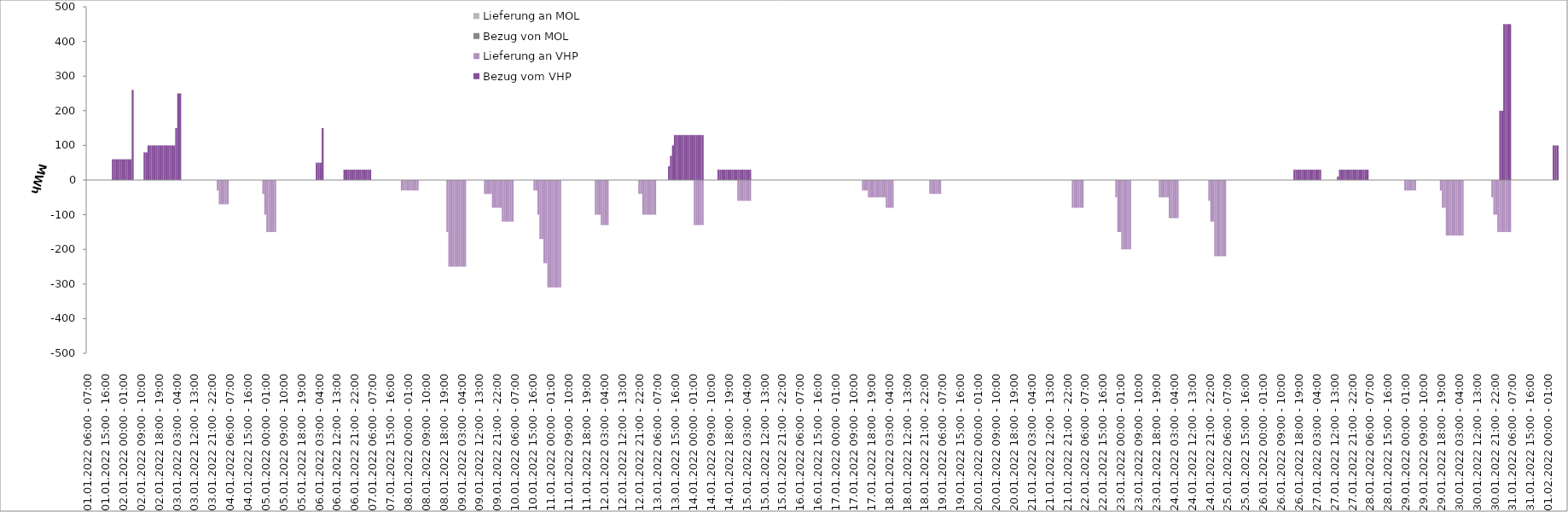
| Category | Bezug vom VHP | Lieferung an VHP | Bezug von MOL | Lieferung an MOL |
|---|---|---|---|---|
| 01.01.2022 06:00 - 07:00 | 0 | 0 | 0 | 0 |
| 01.01.2022 07:00 - 08:00 | 0 | 0 | 0 | 0 |
| 01.01.2022 08:00 - 09:00 | 0 | 0 | 0 | 0 |
| 01.01.2022 09:00 - 10:00 | 0 | 0 | 0 | 0 |
| 01.01.2022 10:00 - 11:00 | 0 | 0 | 0 | 0 |
| 01.01.2022 11:00 - 12:00 | 0 | 0 | 0 | 0 |
| 01.01.2022 12:00 - 13:00 | 0 | 0 | 0 | 0 |
| 01.01.2022 13:00 - 14:00 | 0 | 0 | 0 | 0 |
| 01.01.2022 14:00 - 15:00 | 0 | 0 | 0 | 0 |
| 01.01.2022 15:00 - 16:00 | 0 | 0 | 0 | 0 |
| 01.01.2022 16:00 - 17:00 | 0 | 0 | 0 | 0 |
| 01.01.2022 17:00 - 18:00 | 0 | 0 | 0 | 0 |
| 01.01.2022 18:00 - 19:00 | 0 | 0 | 0 | 0 |
| 01.01.2022 19:00 - 20:00 | 60 | 0 | 0 | 0 |
| 01.01.2022 20:00 - 21:00 | 60 | 0 | 0 | 0 |
| 01.01.2022 21:00 - 22:00 | 60 | 0 | 0 | 0 |
| 01.01.2022 22:00 - 23:00 | 60 | 0 | 0 | 0 |
| 01.01.2022 23:00 - 24:00 | 60 | 0 | 0 | 0 |
| 02.01.2022 00:00 - 01:00 | 60 | 0 | 0 | 0 |
| 02.01.2022 01:00 - 02:00 | 60 | 0 | 0 | 0 |
| 02.01.2022 02:00 - 03:00 | 60 | 0 | 0 | 0 |
| 02.01.2022 03:00 - 04:00 | 60 | 0 | 0 | 0 |
| 02.01.2022 04:00 - 05:00 | 60 | 0 | 0 | 0 |
| 02.01.2022 05:00 - 06:00 | 260 | 0 | 0 | 0 |
| 02.01.2022 06:00 - 07:00 | 0 | 0 | 0 | 0 |
| 02.01.2022 07:00 - 08:00 | 0 | 0 | 0 | 0 |
| 02.01.2022 08:00 - 09:00 | 0 | 0 | 0 | 0 |
| 02.01.2022 09:00 - 10:00 | 0 | 0 | 0 | 0 |
| 02.01.2022 10:00 - 11:00 | 0 | 0 | 0 | 0 |
| 02.01.2022 11:00 - 12:00 | 80 | 0 | 0 | 0 |
| 02.01.2022 12:00 - 13:00 | 80 | 0 | 0 | 0 |
| 02.01.2022 13:00 - 14:00 | 100 | 0 | 0 | 0 |
| 02.01.2022 14:00 - 15:00 | 100 | 0 | 0 | 0 |
| 02.01.2022 15:00 - 16:00 | 100 | 0 | 0 | 0 |
| 02.01.2022 16:00 - 17:00 | 100 | 0 | 0 | 0 |
| 02.01.2022 17:00 - 18:00 | 100 | 0 | 0 | 0 |
| 02.01.2022 18:00 - 19:00 | 100 | 0 | 0 | 0 |
| 02.01.2022 19:00 - 20:00 | 100 | 0 | 0 | 0 |
| 02.01.2022 20:00 - 21:00 | 100 | 0 | 0 | 0 |
| 02.01.2022 21:00 - 22:00 | 100 | 0 | 0 | 0 |
| 02.01.2022 22:00 - 23:00 | 100 | 0 | 0 | 0 |
| 02.01.2022 23:00 - 24:00 | 100 | 0 | 0 | 0 |
| 03.01.2022 00:00 - 01:00 | 100 | 0 | 0 | 0 |
| 03.01.2022 01:00 - 02:00 | 100 | 0 | 0 | 0 |
| 03.01.2022 02:00 - 03:00 | 100 | 0 | 0 | 0 |
| 03.01.2022 03:00 - 04:00 | 150 | 0 | 0 | 0 |
| 03.01.2022 04:00 - 05:00 | 250 | 0 | 0 | 0 |
| 03.01.2022 05:00 - 06:00 | 250 | 0 | 0 | 0 |
| 03.01.2022 06:00 - 07:00 | 0 | 0 | 0 | 0 |
| 03.01.2022 07:00 - 08:00 | 0 | 0 | 0 | 0 |
| 03.01.2022 08:00 - 09:00 | 0 | 0 | 0 | 0 |
| 03.01.2022 09:00 - 10:00 | 0 | 0 | 0 | 0 |
| 03.01.2022 10:00 - 11:00 | 0 | 0 | 0 | 0 |
| 03.01.2022 11:00 - 12:00 | 0 | 0 | 0 | 0 |
| 03.01.2022 12:00 - 13:00 | 0 | 0 | 0 | 0 |
| 03.01.2022 13:00 - 14:00 | 0 | 0 | 0 | 0 |
| 03.01.2022 14:00 - 15:00 | 0 | 0 | 0 | 0 |
| 03.01.2022 15:00 - 16:00 | 0 | 0 | 0 | 0 |
| 03.01.2022 16:00 - 17:00 | 0 | 0 | 0 | 0 |
| 03.01.2022 17:00 - 18:00 | 0 | 0 | 0 | 0 |
| 03.01.2022 18:00 - 19:00 | 0 | 0 | 0 | 0 |
| 03.01.2022 19:00 - 20:00 | 0 | 0 | 0 | 0 |
| 03.01.2022 20:00 - 21:00 | 0 | 0 | 0 | 0 |
| 03.01.2022 21:00 - 22:00 | 0 | 0 | 0 | 0 |
| 03.01.2022 22:00 - 23:00 | 0 | 0 | 0 | 0 |
| 03.01.2022 23:00 - 24:00 | 0 | 0 | 0 | 0 |
| 04.01.2022 00:00 - 01:00 | 0 | -30 | 0 | 0 |
| 04.01.2022 01:00 - 02:00 | 0 | -70 | 0 | 0 |
| 04.01.2022 02:00 - 03:00 | 0 | -70 | 0 | 0 |
| 04.01.2022 03:00 - 04:00 | 0 | -70 | 0 | 0 |
| 04.01.2022 04:00 - 05:00 | 0 | -70 | 0 | 0 |
| 04.01.2022 05:00 - 06:00 | 0 | -70 | 0 | 0 |
| 04.01.2022 06:00 - 07:00 | 0 | 0 | 0 | 0 |
| 04.01.2022 07:00 - 08:00 | 0 | 0 | 0 | 0 |
| 04.01.2022 08:00 - 09:00 | 0 | 0 | 0 | 0 |
| 04.01.2022 09:00 - 10:00 | 0 | 0 | 0 | 0 |
| 04.01.2022 10:00 - 11:00 | 0 | 0 | 0 | 0 |
| 04.01.2022 11:00 - 12:00 | 0 | 0 | 0 | 0 |
| 04.01.2022 12:00 - 13:00 | 0 | 0 | 0 | 0 |
| 04.01.2022 13:00 - 14:00 | 0 | 0 | 0 | 0 |
| 04.01.2022 14:00 - 15:00 | 0 | 0 | 0 | 0 |
| 04.01.2022 15:00 - 16:00 | 0 | 0 | 0 | 0 |
| 04.01.2022 16:00 - 17:00 | 0 | 0 | 0 | 0 |
| 04.01.2022 17:00 - 18:00 | 0 | 0 | 0 | 0 |
| 04.01.2022 18:00 - 19:00 | 0 | 0 | 0 | 0 |
| 04.01.2022 19:00 - 20:00 | 0 | 0 | 0 | 0 |
| 04.01.2022 20:00 - 21:00 | 0 | 0 | 0 | 0 |
| 04.01.2022 21:00 - 22:00 | 0 | 0 | 0 | 0 |
| 04.01.2022 22:00 - 23:00 | 0 | 0 | 0 | 0 |
| 04.01.2022 23:00 - 24:00 | 0 | -40 | 0 | 0 |
| 05.01.2022 00:00 - 01:00 | 0 | -100 | 0 | 0 |
| 05.01.2022 01:00 - 02:00 | 0 | -150 | 0 | 0 |
| 05.01.2022 02:00 - 03:00 | 0 | -150 | 0 | 0 |
| 05.01.2022 03:00 - 04:00 | 0 | -150 | 0 | 0 |
| 05.01.2022 04:00 - 05:00 | 0 | -150 | 0 | 0 |
| 05.01.2022 05:00 - 06:00 | 0 | -150 | 0 | 0 |
| 05.01.2022 06:00 - 07:00 | 0 | 0 | 0 | 0 |
| 05.01.2022 07:00 - 08:00 | 0 | 0 | 0 | 0 |
| 05.01.2022 08:00 - 09:00 | 0 | 0 | 0 | 0 |
| 05.01.2022 09:00 - 10:00 | 0 | 0 | 0 | 0 |
| 05.01.2022 10:00 - 11:00 | 0 | 0 | 0 | 0 |
| 05.01.2022 11:00 - 12:00 | 0 | 0 | 0 | 0 |
| 05.01.2022 12:00 - 13:00 | 0 | 0 | 0 | 0 |
| 05.01.2022 13:00 - 14:00 | 0 | 0 | 0 | 0 |
| 05.01.2022 14:00 - 15:00 | 0 | 0 | 0 | 0 |
| 05.01.2022 15:00 - 16:00 | 0 | 0 | 0 | 0 |
| 05.01.2022 16:00 - 17:00 | 0 | 0 | 0 | 0 |
| 05.01.2022 17:00 - 18:00 | 0 | 0 | 0 | 0 |
| 05.01.2022 18:00 - 19:00 | 0 | 0 | 0 | 0 |
| 05.01.2022 19:00 - 20:00 | 0 | 0 | 0 | 0 |
| 05.01.2022 20:00 - 21:00 | 0 | 0 | 0 | 0 |
| 05.01.2022 21:00 - 22:00 | 0 | 0 | 0 | 0 |
| 05.01.2022 22:00 - 23:00 | 0 | 0 | 0 | 0 |
| 05.01.2022 23:00 - 24:00 | 0 | 0 | 0 | 0 |
| 06.01.2022 00:00 - 01:00 | 0 | 0 | 0 | 0 |
| 06.01.2022 01:00 - 02:00 | 0 | 0 | 0 | 0 |
| 06.01.2022 02:00 - 03:00 | 50 | 0 | 0 | 0 |
| 06.01.2022 03:00 - 04:00 | 50 | 0 | 0 | 0 |
| 06.01.2022 04:00 - 05:00 | 50 | 0 | 0 | 0 |
| 06.01.2022 05:00 - 06:00 | 150 | 0 | 0 | 0 |
| 06.01.2022 06:00 - 07:00 | 0 | 0 | 0 | 0 |
| 06.01.2022 07:00 - 08:00 | 0 | 0 | 0 | 0 |
| 06.01.2022 08:00 - 09:00 | 0 | 0 | 0 | 0 |
| 06.01.2022 09:00 - 10:00 | 0 | 0 | 0 | 0 |
| 06.01.2022 10:00 - 11:00 | 0 | 0 | 0 | 0 |
| 06.01.2022 11:00 - 12:00 | 0 | 0 | 0 | 0 |
| 06.01.2022 12:00 - 13:00 | 0 | 0 | 0 | 0 |
| 06.01.2022 13:00 - 14:00 | 0 | 0 | 0 | 0 |
| 06.01.2022 14:00 - 15:00 | 0 | 0 | 0 | 0 |
| 06.01.2022 15:00 - 16:00 | 0 | 0 | 0 | 0 |
| 06.01.2022 16:00 - 17:00 | 30 | 0 | 0 | 0 |
| 06.01.2022 17:00 - 18:00 | 30 | 0 | 0 | 0 |
| 06.01.2022 18:00 - 19:00 | 30 | 0 | 0 | 0 |
| 06.01.2022 19:00 - 20:00 | 30 | 0 | 0 | 0 |
| 06.01.2022 20:00 - 21:00 | 30 | 0 | 0 | 0 |
| 06.01.2022 21:00 - 22:00 | 30 | 0 | 0 | 0 |
| 06.01.2022 22:00 - 23:00 | 30 | 0 | 0 | 0 |
| 06.01.2022 23:00 - 24:00 | 30 | 0 | 0 | 0 |
| 07.01.2022 00:00 - 01:00 | 30 | 0 | 0 | 0 |
| 07.01.2022 01:00 - 02:00 | 30 | 0 | 0 | 0 |
| 07.01.2022 02:00 - 03:00 | 30 | 0 | 0 | 0 |
| 07.01.2022 03:00 - 04:00 | 30 | 0 | 0 | 0 |
| 07.01.2022 04:00 - 05:00 | 30 | 0 | 0 | 0 |
| 07.01.2022 05:00 - 06:00 | 30 | 0 | 0 | 0 |
| 07.01.2022 06:00 - 07:00 | 0 | 0 | 0 | 0 |
| 07.01.2022 07:00 - 08:00 | 0 | 0 | 0 | 0 |
| 07.01.2022 08:00 - 09:00 | 0 | 0 | 0 | 0 |
| 07.01.2022 09:00 - 10:00 | 0 | 0 | 0 | 0 |
| 07.01.2022 10:00 - 11:00 | 0 | 0 | 0 | 0 |
| 07.01.2022 11:00 - 12:00 | 0 | 0 | 0 | 0 |
| 07.01.2022 12:00 - 13:00 | 0 | 0 | 0 | 0 |
| 07.01.2022 13:00 - 14:00 | 0 | 0 | 0 | 0 |
| 07.01.2022 14:00 - 15:00 | 0 | 0 | 0 | 0 |
| 07.01.2022 15:00 - 16:00 | 0 | 0 | 0 | 0 |
| 07.01.2022 16:00 - 17:00 | 0 | 0 | 0 | 0 |
| 07.01.2022 17:00 - 18:00 | 0 | 0 | 0 | 0 |
| 07.01.2022 18:00 - 19:00 | 0 | 0 | 0 | 0 |
| 07.01.2022 19:00 - 20:00 | 0 | 0 | 0 | 0 |
| 07.01.2022 20:00 - 21:00 | 0 | 0 | 0 | 0 |
| 07.01.2022 21:00 - 22:00 | 0 | -30 | 0 | 0 |
| 07.01.2022 22:00 - 23:00 | 0 | -30 | 0 | 0 |
| 07.01.2022 23:00 - 24:00 | 0 | -30 | 0 | 0 |
| 08.01.2022 00:00 - 01:00 | 0 | -30 | 0 | 0 |
| 08.01.2022 01:00 - 02:00 | 0 | -30 | 0 | 0 |
| 08.01.2022 02:00 - 03:00 | 0 | -30 | 0 | 0 |
| 08.01.2022 03:00 - 04:00 | 0 | -30 | 0 | 0 |
| 08.01.2022 04:00 - 05:00 | 0 | -30 | 0 | 0 |
| 08.01.2022 05:00 - 06:00 | 0 | -30 | 0 | 0 |
| 08.01.2022 06:00 - 07:00 | 0 | 0 | 0 | 0 |
| 08.01.2022 07:00 - 08:00 | 0 | 0 | 0 | 0 |
| 08.01.2022 08:00 - 09:00 | 0 | 0 | 0 | 0 |
| 08.01.2022 09:00 - 10:00 | 0 | 0 | 0 | 0 |
| 08.01.2022 10:00 - 11:00 | 0 | 0 | 0 | 0 |
| 08.01.2022 11:00 - 12:00 | 0 | 0 | 0 | 0 |
| 08.01.2022 12:00 - 13:00 | 0 | 0 | 0 | 0 |
| 08.01.2022 13:00 - 14:00 | 0 | 0 | 0 | 0 |
| 08.01.2022 14:00 - 15:00 | 0 | 0 | 0 | 0 |
| 08.01.2022 15:00 - 16:00 | 0 | 0 | 0 | 0 |
| 08.01.2022 16:00 - 17:00 | 0 | 0 | 0 | 0 |
| 08.01.2022 17:00 - 18:00 | 0 | 0 | 0 | 0 |
| 08.01.2022 18:00 - 19:00 | 0 | 0 | 0 | 0 |
| 08.01.2022 19:00 - 20:00 | 0 | 0 | 0 | 0 |
| 08.01.2022 20:00 - 21:00 | 0 | -150 | 0 | 0 |
| 08.01.2022 21:00 - 22:00 | 0 | -250 | 0 | 0 |
| 08.01.2022 22:00 - 23:00 | 0 | -250 | 0 | 0 |
| 08.01.2022 23:00 - 24:00 | 0 | -250 | 0 | 0 |
| 09.01.2022 00:00 - 01:00 | 0 | -250 | 0 | 0 |
| 09.01.2022 01:00 - 02:00 | 0 | -250 | 0 | 0 |
| 09.01.2022 02:00 - 03:00 | 0 | -250 | 0 | 0 |
| 09.01.2022 03:00 - 04:00 | 0 | -250 | 0 | 0 |
| 09.01.2022 04:00 - 05:00 | 0 | -250 | 0 | 0 |
| 09.01.2022 05:00 - 06:00 | 0 | -250 | 0 | 0 |
| 09.01.2022 06:00 - 07:00 | 0 | 0 | 0 | 0 |
| 09.01.2022 07:00 - 08:00 | 0 | 0 | 0 | 0 |
| 09.01.2022 08:00 - 09:00 | 0 | 0 | 0 | 0 |
| 09.01.2022 09:00 - 10:00 | 0 | 0 | 0 | 0 |
| 09.01.2022 10:00 - 11:00 | 0 | 0 | 0 | 0 |
| 09.01.2022 11:00 - 12:00 | 0 | 0 | 0 | 0 |
| 09.01.2022 12:00 - 13:00 | 0 | 0 | 0 | 0 |
| 09.01.2022 13:00 - 14:00 | 0 | 0 | 0 | 0 |
| 09.01.2022 14:00 - 15:00 | 0 | 0 | 0 | 0 |
| 09.01.2022 15:00 - 16:00 | 0 | -40 | 0 | 0 |
| 09.01.2022 16:00 - 17:00 | 0 | -40 | 0 | 0 |
| 09.01.2022 17:00 - 18:00 | 0 | -40 | 0 | 0 |
| 09.01.2022 18:00 - 19:00 | 0 | -40 | 0 | 0 |
| 09.01.2022 19:00 - 20:00 | 0 | -80 | 0 | 0 |
| 09.01.2022 20:00 - 21:00 | 0 | -80 | 0 | 0 |
| 09.01.2022 21:00 - 22:00 | 0 | -80 | 0 | 0 |
| 09.01.2022 22:00 - 23:00 | 0 | -80 | 0 | 0 |
| 09.01.2022 23:00 - 24:00 | 0 | -80 | 0 | 0 |
| 10.01.2022 00:00 - 01:00 | 0 | -120 | 0 | 0 |
| 10.01.2022 01:00 - 02:00 | 0 | -120 | 0 | 0 |
| 10.01.2022 02:00 - 03:00 | 0 | -120 | 0 | 0 |
| 10.01.2022 03:00 - 04:00 | 0 | -120 | 0 | 0 |
| 10.01.2022 04:00 - 05:00 | 0 | -120 | 0 | 0 |
| 10.01.2022 05:00 - 06:00 | 0 | -120 | 0 | 0 |
| 10.01.2022 06:00 - 07:00 | 0 | 0 | 0 | 0 |
| 10.01.2022 07:00 - 08:00 | 0 | 0 | 0 | 0 |
| 10.01.2022 08:00 - 09:00 | 0 | 0 | 0 | 0 |
| 10.01.2022 09:00 - 10:00 | 0 | 0 | 0 | 0 |
| 10.01.2022 10:00 - 11:00 | 0 | 0 | 0 | 0 |
| 10.01.2022 11:00 - 12:00 | 0 | 0 | 0 | 0 |
| 10.01.2022 12:00 - 13:00 | 0 | 0 | 0 | 0 |
| 10.01.2022 13:00 - 14:00 | 0 | 0 | 0 | 0 |
| 10.01.2022 14:00 - 15:00 | 0 | 0 | 0 | 0 |
| 10.01.2022 15:00 - 16:00 | 0 | 0 | 0 | 0 |
| 10.01.2022 16:00 - 17:00 | 0 | -30 | 0 | 0 |
| 10.01.2022 17:00 - 18:00 | 0 | -30 | 0 | 0 |
| 10.01.2022 18:00 - 19:00 | 0 | -100 | 0 | 0 |
| 10.01.2022 19:00 - 20:00 | 0 | -170 | 0 | 0 |
| 10.01.2022 20:00 - 21:00 | 0 | -170 | 0 | 0 |
| 10.01.2022 21:00 - 22:00 | 0 | -240 | 0 | 0 |
| 10.01.2022 22:00 - 23:00 | 0 | -240 | 0 | 0 |
| 10.01.2022 23:00 - 24:00 | 0 | -310 | 0 | 0 |
| 11.01.2022 00:00 - 01:00 | 0 | -310 | 0 | 0 |
| 11.01.2022 01:00 - 02:00 | 0 | -310 | 0 | 0 |
| 11.01.2022 02:00 - 03:00 | 0 | -310 | 0 | 0 |
| 11.01.2022 03:00 - 04:00 | 0 | -310 | 0 | 0 |
| 11.01.2022 04:00 - 05:00 | 0 | -310 | 0 | 0 |
| 11.01.2022 05:00 - 06:00 | 0 | -310 | 0 | 0 |
| 11.01.2022 06:00 - 07:00 | 0 | 0 | 0 | 0 |
| 11.01.2022 07:00 - 08:00 | 0 | 0 | 0 | 0 |
| 11.01.2022 08:00 - 09:00 | 0 | 0 | 0 | 0 |
| 11.01.2022 09:00 - 10:00 | 0 | 0 | 0 | 0 |
| 11.01.2022 10:00 - 11:00 | 0 | 0 | 0 | 0 |
| 11.01.2022 11:00 - 12:00 | 0 | 0 | 0 | 0 |
| 11.01.2022 12:00 - 13:00 | 0 | 0 | 0 | 0 |
| 11.01.2022 13:00 - 14:00 | 0 | 0 | 0 | 0 |
| 11.01.2022 14:00 - 15:00 | 0 | 0 | 0 | 0 |
| 11.01.2022 15:00 - 16:00 | 0 | 0 | 0 | 0 |
| 11.01.2022 16:00 - 17:00 | 0 | 0 | 0 | 0 |
| 11.01.2022 17:00 - 18:00 | 0 | 0 | 0 | 0 |
| 11.01.2022 18:00 - 19:00 | 0 | 0 | 0 | 0 |
| 11.01.2022 19:00 - 20:00 | 0 | 0 | 0 | 0 |
| 11.01.2022 20:00 - 21:00 | 0 | 0 | 0 | 0 |
| 11.01.2022 21:00 - 22:00 | 0 | 0 | 0 | 0 |
| 11.01.2022 22:00 - 23:00 | 0 | 0 | 0 | 0 |
| 11.01.2022 23:00 - 24:00 | 0 | -100 | 0 | 0 |
| 12.01.2022 00:00 - 01:00 | 0 | -100 | 0 | 0 |
| 12.01.2022 01:00 - 02:00 | 0 | -100 | 0 | 0 |
| 12.01.2022 02:00 - 03:00 | 0 | -130 | 0 | 0 |
| 12.01.2022 03:00 - 04:00 | 0 | -130 | 0 | 0 |
| 12.01.2022 04:00 - 05:00 | 0 | -130 | 0 | 0 |
| 12.01.2022 05:00 - 06:00 | 0 | -130 | 0 | 0 |
| 12.01.2022 06:00 - 07:00 | 0 | 0 | 0 | 0 |
| 12.01.2022 07:00 - 08:00 | 0 | 0 | 0 | 0 |
| 12.01.2022 08:00 - 09:00 | 0 | 0 | 0 | 0 |
| 12.01.2022 09:00 - 10:00 | 0 | 0 | 0 | 0 |
| 12.01.2022 10:00 - 11:00 | 0 | 0 | 0 | 0 |
| 12.01.2022 11:00 - 12:00 | 0 | 0 | 0 | 0 |
| 12.01.2022 12:00 - 13:00 | 0 | 0 | 0 | 0 |
| 12.01.2022 13:00 - 14:00 | 0 | 0 | 0 | 0 |
| 12.01.2022 14:00 - 15:00 | 0 | 0 | 0 | 0 |
| 12.01.2022 15:00 - 16:00 | 0 | 0 | 0 | 0 |
| 12.01.2022 16:00 - 17:00 | 0 | 0 | 0 | 0 |
| 12.01.2022 17:00 - 18:00 | 0 | 0 | 0 | 0 |
| 12.01.2022 18:00 - 19:00 | 0 | 0 | 0 | 0 |
| 12.01.2022 19:00 - 20:00 | 0 | 0 | 0 | 0 |
| 12.01.2022 20:00 - 21:00 | 0 | 0 | 0 | 0 |
| 12.01.2022 21:00 - 22:00 | 0 | -40 | 0 | 0 |
| 12.01.2022 22:00 - 23:00 | 0 | -40 | 0 | 0 |
| 12.01.2022 23:00 - 24:00 | 0 | -100 | 0 | 0 |
| 13.01.2022 00:00 - 01:00 | 0 | -100 | 0 | 0 |
| 13.01.2022 01:00 - 02:00 | 0 | -100 | 0 | 0 |
| 13.01.2022 02:00 - 03:00 | 0 | -100 | 0 | 0 |
| 13.01.2022 03:00 - 04:00 | 0 | -100 | 0 | 0 |
| 13.01.2022 04:00 - 05:00 | 0 | -100 | 0 | 0 |
| 13.01.2022 05:00 - 06:00 | 0 | -100 | 0 | 0 |
| 13.01.2022 06:00 - 07:00 | 0 | 0 | 0 | 0 |
| 13.01.2022 07:00 - 08:00 | 0 | 0 | 0 | 0 |
| 13.01.2022 08:00 - 09:00 | 0 | 0 | 0 | 0 |
| 13.01.2022 09:00 - 10:00 | 0 | 0 | 0 | 0 |
| 13.01.2022 10:00 - 11:00 | 0 | 0 | 0 | 0 |
| 13.01.2022 11:00 - 12:00 | 0 | 0 | 0 | 0 |
| 13.01.2022 12:00 - 13:00 | 40 | 0 | 0 | 0 |
| 13.01.2022 13:00 - 14:00 | 70 | 0 | 0 | 0 |
| 13.01.2022 14:00 - 15:00 | 100 | 0 | 0 | 0 |
| 13.01.2022 15:00 - 16:00 | 130 | 0 | 0 | 0 |
| 13.01.2022 16:00 - 17:00 | 130 | 0 | 0 | 0 |
| 13.01.2022 17:00 - 18:00 | 130 | 0 | 0 | 0 |
| 13.01.2022 18:00 - 19:00 | 130 | 0 | 0 | 0 |
| 13.01.2022 19:00 - 20:00 | 130 | 0 | 0 | 0 |
| 13.01.2022 20:00 - 21:00 | 130 | 0 | 0 | 0 |
| 13.01.2022 21:00 - 22:00 | 130 | 0 | 0 | 0 |
| 13.01.2022 22:00 - 23:00 | 130 | 0 | 0 | 0 |
| 13.01.2022 23:00 - 24:00 | 130 | 0 | 0 | 0 |
| 14.01.2022 00:00 - 01:00 | 130 | 0 | 0 | 0 |
| 14.01.2022 01:00 - 02:00 | 130 | -130 | 0 | 0 |
| 14.01.2022 02:00 - 03:00 | 130 | -130 | 0 | 0 |
| 14.01.2022 03:00 - 04:00 | 130 | -130 | 0 | 0 |
| 14.01.2022 04:00 - 05:00 | 130 | -130 | 0 | 0 |
| 14.01.2022 05:00 - 06:00 | 130 | -130 | 0 | 0 |
| 14.01.2022 06:00 - 07:00 | 0 | 0 | 0 | 0 |
| 14.01.2022 07:00 - 08:00 | 0 | 0 | 0 | 0 |
| 14.01.2022 08:00 - 09:00 | 0 | 0 | 0 | 0 |
| 14.01.2022 09:00 - 10:00 | 0 | 0 | 0 | 0 |
| 14.01.2022 10:00 - 11:00 | 0 | 0 | 0 | 0 |
| 14.01.2022 11:00 - 12:00 | 0 | 0 | 0 | 0 |
| 14.01.2022 12:00 - 13:00 | 0 | 0 | 0 | 0 |
| 14.01.2022 13:00 - 14:00 | 30 | 0 | 0 | 0 |
| 14.01.2022 14:00 - 15:00 | 30 | 0 | 0 | 0 |
| 14.01.2022 15:00 - 16:00 | 30 | 0 | 0 | 0 |
| 14.01.2022 16:00 - 17:00 | 30 | 0 | 0 | 0 |
| 14.01.2022 17:00 - 18:00 | 30 | 0 | 0 | 0 |
| 14.01.2022 18:00 - 19:00 | 30 | 0 | 0 | 0 |
| 14.01.2022 19:00 - 20:00 | 30 | 0 | 0 | 0 |
| 14.01.2022 20:00 - 21:00 | 30 | 0 | 0 | 0 |
| 14.01.2022 21:00 - 22:00 | 30 | 0 | 0 | 0 |
| 14.01.2022 22:00 - 23:00 | 30 | 0 | 0 | 0 |
| 14.01.2022 23:00 - 24:00 | 30 | -60 | 0 | 0 |
| 15.01.2022 00:00 - 01:00 | 30 | -60 | 0 | 0 |
| 15.01.2022 01:00 - 02:00 | 30 | -60 | 0 | 0 |
| 15.01.2022 02:00 - 03:00 | 30 | -60 | 0 | 0 |
| 15.01.2022 03:00 - 04:00 | 30 | -60 | 0 | 0 |
| 15.01.2022 04:00 - 05:00 | 30 | -60 | 0 | 0 |
| 15.01.2022 05:00 - 06:00 | 30 | -60 | 0 | 0 |
| 15.01.2022 06:00 - 07:00 | 0 | 0 | 0 | 0 |
| 15.01.2022 07:00 - 08:00 | 0 | 0 | 0 | 0 |
| 15.01.2022 08:00 - 09:00 | 0 | 0 | 0 | 0 |
| 15.01.2022 09:00 - 10:00 | 0 | 0 | 0 | 0 |
| 15.01.2022 10:00 - 11:00 | 0 | 0 | 0 | 0 |
| 15.01.2022 11:00 - 12:00 | 0 | 0 | 0 | 0 |
| 15.01.2022 12:00 - 13:00 | 0 | 0 | 0 | 0 |
| 15.01.2022 13:00 - 14:00 | 0 | 0 | 0 | 0 |
| 15.01.2022 14:00 - 15:00 | 0 | 0 | 0 | 0 |
| 15.01.2022 15:00 - 16:00 | 0 | 0 | 0 | 0 |
| 15.01.2022 16:00 - 17:00 | 0 | 0 | 0 | 0 |
| 15.01.2022 17:00 - 18:00 | 0 | 0 | 0 | 0 |
| 15.01.2022 18:00 - 19:00 | 0 | 0 | 0 | 0 |
| 15.01.2022 19:00 - 20:00 | 0 | 0 | 0 | 0 |
| 15.01.2022 20:00 - 21:00 | 0 | 0 | 0 | 0 |
| 15.01.2022 21:00 - 22:00 | 0 | 0 | 0 | 0 |
| 15.01.2022 22:00 - 23:00 | 0 | 0 | 0 | 0 |
| 15.01.2022 23:00 - 24:00 | 0 | 0 | 0 | 0 |
| 16.01.2022 00:00 - 01:00 | 0 | 0 | 0 | 0 |
| 16.01.2022 01:00 - 02:00 | 0 | 0 | 0 | 0 |
| 16.01.2022 02:00 - 03:00 | 0 | 0 | 0 | 0 |
| 16.01.2022 03:00 - 04:00 | 0 | 0 | 0 | 0 |
| 16.01.2022 04:00 - 05:00 | 0 | 0 | 0 | 0 |
| 16.01.2022 05:00 - 06:00 | 0 | 0 | 0 | 0 |
| 16.01.2022 06:00 - 07:00 | 0 | 0 | 0 | 0 |
| 16.01.2022 07:00 - 08:00 | 0 | 0 | 0 | 0 |
| 16.01.2022 08:00 - 09:00 | 0 | 0 | 0 | 0 |
| 16.01.2022 09:00 - 10:00 | 0 | 0 | 0 | 0 |
| 16.01.2022 10:00 - 11:00 | 0 | 0 | 0 | 0 |
| 16.01.2022 11:00 - 12:00 | 0 | 0 | 0 | 0 |
| 16.01.2022 12:00 - 13:00 | 0 | 0 | 0 | 0 |
| 16.01.2022 13:00 - 14:00 | 0 | 0 | 0 | 0 |
| 16.01.2022 14:00 - 15:00 | 0 | 0 | 0 | 0 |
| 16.01.2022 15:00 - 16:00 | 0 | 0 | 0 | 0 |
| 16.01.2022 16:00 - 17:00 | 0 | 0 | 0 | 0 |
| 16.01.2022 17:00 - 18:00 | 0 | 0 | 0 | 0 |
| 16.01.2022 18:00 - 19:00 | 0 | 0 | 0 | 0 |
| 16.01.2022 19:00 - 20:00 | 0 | 0 | 0 | 0 |
| 16.01.2022 20:00 - 21:00 | 0 | 0 | 0 | 0 |
| 16.01.2022 21:00 - 22:00 | 0 | 0 | 0 | 0 |
| 16.01.2022 22:00 - 23:00 | 0 | 0 | 0 | 0 |
| 16.01.2022 23:00 - 24:00 | 0 | 0 | 0 | 0 |
| 17.01.2022 00:00 - 01:00 | 0 | 0 | 0 | 0 |
| 17.01.2022 01:00 - 02:00 | 0 | 0 | 0 | 0 |
| 17.01.2022 02:00 - 03:00 | 0 | 0 | 0 | 0 |
| 17.01.2022 03:00 - 04:00 | 0 | 0 | 0 | 0 |
| 17.01.2022 04:00 - 05:00 | 0 | 0 | 0 | 0 |
| 17.01.2022 05:00 - 06:00 | 0 | 0 | 0 | 0 |
| 17.01.2022 06:00 - 07:00 | 0 | 0 | 0 | 0 |
| 17.01.2022 07:00 - 08:00 | 0 | 0 | 0 | 0 |
| 17.01.2022 08:00 - 09:00 | 0 | 0 | 0 | 0 |
| 17.01.2022 09:00 - 10:00 | 0 | 0 | 0 | 0 |
| 17.01.2022 10:00 - 11:00 | 0 | 0 | 0 | 0 |
| 17.01.2022 11:00 - 12:00 | 0 | 0 | 0 | 0 |
| 17.01.2022 12:00 - 13:00 | 0 | 0 | 0 | 0 |
| 17.01.2022 13:00 - 14:00 | 0 | 0 | 0 | 0 |
| 17.01.2022 14:00 - 15:00 | 0 | -30 | 0 | 0 |
| 17.01.2022 15:00 - 16:00 | 0 | -30 | 0 | 0 |
| 17.01.2022 16:00 - 17:00 | 0 | -30 | 0 | 0 |
| 17.01.2022 17:00 - 18:00 | 0 | -50 | 0 | 0 |
| 17.01.2022 18:00 - 19:00 | 0 | -50 | 0 | 0 |
| 17.01.2022 19:00 - 20:00 | 0 | -50 | 0 | 0 |
| 17.01.2022 20:00 - 21:00 | 0 | -50 | 0 | 0 |
| 17.01.2022 21:00 - 22:00 | 0 | -50 | 0 | 0 |
| 17.01.2022 22:00 - 23:00 | 0 | -50 | 0 | 0 |
| 17.01.2022 23:00 - 24:00 | 0 | -50 | 0 | 0 |
| 18.01.2022 00:00 - 01:00 | 0 | -50 | 0 | 0 |
| 18.01.2022 01:00 - 02:00 | 0 | -50 | 0 | 0 |
| 18.01.2022 02:00 - 03:00 | 0 | -80 | 0 | 0 |
| 18.01.2022 03:00 - 04:00 | 0 | -80 | 0 | 0 |
| 18.01.2022 04:00 - 05:00 | 0 | -80 | 0 | 0 |
| 18.01.2022 05:00 - 06:00 | 0 | -80 | 0 | 0 |
| 18.01.2022 06:00 - 07:00 | 0 | 0 | 0 | 0 |
| 18.01.2022 07:00 - 08:00 | 0 | 0 | 0 | 0 |
| 18.01.2022 08:00 - 09:00 | 0 | 0 | 0 | 0 |
| 18.01.2022 09:00 - 10:00 | 0 | 0 | 0 | 0 |
| 18.01.2022 10:00 - 11:00 | 0 | 0 | 0 | 0 |
| 18.01.2022 11:00 - 12:00 | 0 | 0 | 0 | 0 |
| 18.01.2022 12:00 - 13:00 | 0 | 0 | 0 | 0 |
| 18.01.2022 13:00 - 14:00 | 0 | 0 | 0 | 0 |
| 18.01.2022 14:00 - 15:00 | 0 | 0 | 0 | 0 |
| 18.01.2022 15:00 - 16:00 | 0 | 0 | 0 | 0 |
| 18.01.2022 16:00 - 17:00 | 0 | 0 | 0 | 0 |
| 18.01.2022 17:00 - 18:00 | 0 | 0 | 0 | 0 |
| 18.01.2022 18:00 - 19:00 | 0 | 0 | 0 | 0 |
| 18.01.2022 19:00 - 20:00 | 0 | 0 | 0 | 0 |
| 18.01.2022 20:00 - 21:00 | 0 | 0 | 0 | 0 |
| 18.01.2022 21:00 - 22:00 | 0 | 0 | 0 | 0 |
| 18.01.2022 22:00 - 23:00 | 0 | 0 | 0 | 0 |
| 18.01.2022 23:00 - 24:00 | 0 | 0 | 0 | 0 |
| 19.01.2022 00:00 - 01:00 | 0 | -40 | 0 | 0 |
| 19.01.2022 01:00 - 02:00 | 0 | -40 | 0 | 0 |
| 19.01.2022 02:00 - 03:00 | 0 | -40 | 0 | 0 |
| 19.01.2022 03:00 - 04:00 | 0 | -40 | 0 | 0 |
| 19.01.2022 04:00 - 05:00 | 0 | -40 | 0 | 0 |
| 19.01.2022 05:00 - 06:00 | 0 | -40 | 0 | 0 |
| 19.01.2022 06:00 - 07:00 | 0 | 0 | 0 | 0 |
| 19.01.2022 07:00 - 08:00 | 0 | 0 | 0 | 0 |
| 19.01.2022 08:00 - 09:00 | 0 | 0 | 0 | 0 |
| 19.01.2022 09:00 - 10:00 | 0 | 0 | 0 | 0 |
| 19.01.2022 10:00 - 11:00 | 0 | 0 | 0 | 0 |
| 19.01.2022 11:00 - 12:00 | 0 | 0 | 0 | 0 |
| 19.01.2022 12:00 - 13:00 | 0 | 0 | 0 | 0 |
| 19.01.2022 13:00 - 14:00 | 0 | 0 | 0 | 0 |
| 19.01.2022 14:00 - 15:00 | 0 | 0 | 0 | 0 |
| 19.01.2022 15:00 - 16:00 | 0 | 0 | 0 | 0 |
| 19.01.2022 16:00 - 17:00 | 0 | 0 | 0 | 0 |
| 19.01.2022 17:00 - 18:00 | 0 | 0 | 0 | 0 |
| 19.01.2022 18:00 - 19:00 | 0 | 0 | 0 | 0 |
| 19.01.2022 19:00 - 20:00 | 0 | 0 | 0 | 0 |
| 19.01.2022 20:00 - 21:00 | 0 | 0 | 0 | 0 |
| 19.01.2022 21:00 - 22:00 | 0 | 0 | 0 | 0 |
| 19.01.2022 22:00 - 23:00 | 0 | 0 | 0 | 0 |
| 19.01.2022 23:00 - 24:00 | 0 | 0 | 0 | 0 |
| 20.01.2022 00:00 - 01:00 | 0 | 0 | 0 | 0 |
| 20.01.2022 01:00 - 02:00 | 0 | 0 | 0 | 0 |
| 20.01.2022 02:00 - 03:00 | 0 | 0 | 0 | 0 |
| 20.01.2022 03:00 - 04:00 | 0 | 0 | 0 | 0 |
| 20.01.2022 04:00 - 05:00 | 0 | 0 | 0 | 0 |
| 20.01.2022 05:00 - 06:00 | 0 | 0 | 0 | 0 |
| 20.01.2022 06:00 - 07:00 | 0 | 0 | 0 | 0 |
| 20.01.2022 07:00 - 08:00 | 0 | 0 | 0 | 0 |
| 20.01.2022 08:00 - 09:00 | 0 | 0 | 0 | 0 |
| 20.01.2022 09:00 - 10:00 | 0 | 0 | 0 | 0 |
| 20.01.2022 10:00 - 11:00 | 0 | 0 | 0 | 0 |
| 20.01.2022 11:00 - 12:00 | 0 | 0 | 0 | 0 |
| 20.01.2022 12:00 - 13:00 | 0 | 0 | 0 | 0 |
| 20.01.2022 13:00 - 14:00 | 0 | 0 | 0 | 0 |
| 20.01.2022 14:00 - 15:00 | 0 | 0 | 0 | 0 |
| 20.01.2022 15:00 - 16:00 | 0 | 0 | 0 | 0 |
| 20.01.2022 16:00 - 17:00 | 0 | 0 | 0 | 0 |
| 20.01.2022 17:00 - 18:00 | 0 | 0 | 0 | 0 |
| 20.01.2022 18:00 - 19:00 | 0 | 0 | 0 | 0 |
| 20.01.2022 19:00 - 20:00 | 0 | 0 | 0 | 0 |
| 20.01.2022 20:00 - 21:00 | 0 | 0 | 0 | 0 |
| 20.01.2022 21:00 - 22:00 | 0 | 0 | 0 | 0 |
| 20.01.2022 22:00 - 23:00 | 0 | 0 | 0 | 0 |
| 20.01.2022 23:00 - 24:00 | 0 | 0 | 0 | 0 |
| 21.01.2022 00:00 - 01:00 | 0 | 0 | 0 | 0 |
| 21.01.2022 01:00 - 02:00 | 0 | 0 | 0 | 0 |
| 21.01.2022 02:00 - 03:00 | 0 | 0 | 0 | 0 |
| 21.01.2022 03:00 - 04:00 | 0 | 0 | 0 | 0 |
| 21.01.2022 04:00 - 05:00 | 0 | 0 | 0 | 0 |
| 21.01.2022 05:00 - 06:00 | 0 | 0 | 0 | 0 |
| 21.01.2022 06:00 - 07:00 | 0 | 0 | 0 | 0 |
| 21.01.2022 07:00 - 08:00 | 0 | 0 | 0 | 0 |
| 21.01.2022 08:00 - 09:00 | 0 | 0 | 0 | 0 |
| 21.01.2022 09:00 - 10:00 | 0 | 0 | 0 | 0 |
| 21.01.2022 10:00 - 11:00 | 0 | 0 | 0 | 0 |
| 21.01.2022 11:00 - 12:00 | 0 | 0 | 0 | 0 |
| 21.01.2022 12:00 - 13:00 | 0 | 0 | 0 | 0 |
| 21.01.2022 13:00 - 14:00 | 0 | 0 | 0 | 0 |
| 21.01.2022 14:00 - 15:00 | 0 | 0 | 0 | 0 |
| 21.01.2022 15:00 - 16:00 | 0 | 0 | 0 | 0 |
| 21.01.2022 16:00 - 17:00 | 0 | 0 | 0 | 0 |
| 21.01.2022 17:00 - 18:00 | 0 | 0 | 0 | 0 |
| 21.01.2022 18:00 - 19:00 | 0 | 0 | 0 | 0 |
| 21.01.2022 19:00 - 20:00 | 0 | 0 | 0 | 0 |
| 21.01.2022 20:00 - 21:00 | 0 | 0 | 0 | 0 |
| 21.01.2022 21:00 - 22:00 | 0 | 0 | 0 | 0 |
| 21.01.2022 22:00 - 23:00 | 0 | 0 | 0 | 0 |
| 21.01.2022 23:00 - 24:00 | 0 | 0 | 0 | 0 |
| 22.01.2022 00:00 - 01:00 | 0 | -80 | 0 | 0 |
| 22.01.2022 01:00 - 02:00 | 0 | -80 | 0 | 0 |
| 22.01.2022 02:00 - 03:00 | 0 | -80 | 0 | 0 |
| 22.01.2022 03:00 - 04:00 | 0 | -80 | 0 | 0 |
| 22.01.2022 04:00 - 05:00 | 0 | -80 | 0 | 0 |
| 22.01.2022 05:00 - 06:00 | 0 | -80 | 0 | 0 |
| 22.01.2022 06:00 - 07:00 | 0 | 0 | 0 | 0 |
| 22.01.2022 07:00 - 08:00 | 0 | 0 | 0 | 0 |
| 22.01.2022 08:00 - 09:00 | 0 | 0 | 0 | 0 |
| 22.01.2022 09:00 - 10:00 | 0 | 0 | 0 | 0 |
| 22.01.2022 10:00 - 11:00 | 0 | 0 | 0 | 0 |
| 22.01.2022 11:00 - 12:00 | 0 | 0 | 0 | 0 |
| 22.01.2022 12:00 - 13:00 | 0 | 0 | 0 | 0 |
| 22.01.2022 13:00 - 14:00 | 0 | 0 | 0 | 0 |
| 22.01.2022 14:00 - 15:00 | 0 | 0 | 0 | 0 |
| 22.01.2022 15:00 - 16:00 | 0 | 0 | 0 | 0 |
| 22.01.2022 16:00 - 17:00 | 0 | 0 | 0 | 0 |
| 22.01.2022 17:00 - 18:00 | 0 | 0 | 0 | 0 |
| 22.01.2022 18:00 - 19:00 | 0 | 0 | 0 | 0 |
| 22.01.2022 19:00 - 20:00 | 0 | 0 | 0 | 0 |
| 22.01.2022 20:00 - 21:00 | 0 | 0 | 0 | 0 |
| 22.01.2022 21:00 - 22:00 | 0 | 0 | 0 | 0 |
| 22.01.2022 22:00 - 23:00 | 0 | -50 | 0 | 0 |
| 22.01.2022 23:00 - 24:00 | 0 | -150 | 0 | 0 |
| 23.01.2022 00:00 - 01:00 | 0 | -150 | 0 | 0 |
| 23.01.2022 01:00 - 02:00 | 0 | -200 | 0 | 0 |
| 23.01.2022 02:00 - 03:00 | 0 | -200 | 0 | 0 |
| 23.01.2022 03:00 - 04:00 | 0 | -200 | 0 | 0 |
| 23.01.2022 04:00 - 05:00 | 0 | -200 | 0 | 0 |
| 23.01.2022 05:00 - 06:00 | 0 | -200 | 0 | 0 |
| 23.01.2022 06:00 - 07:00 | 0 | 0 | 0 | 0 |
| 23.01.2022 07:00 - 08:00 | 0 | 0 | 0 | 0 |
| 23.01.2022 08:00 - 09:00 | 0 | 0 | 0 | 0 |
| 23.01.2022 09:00 - 10:00 | 0 | 0 | 0 | 0 |
| 23.01.2022 10:00 - 11:00 | 0 | 0 | 0 | 0 |
| 23.01.2022 11:00 - 12:00 | 0 | 0 | 0 | 0 |
| 23.01.2022 12:00 - 13:00 | 0 | 0 | 0 | 0 |
| 23.01.2022 13:00 - 14:00 | 0 | 0 | 0 | 0 |
| 23.01.2022 14:00 - 15:00 | 0 | 0 | 0 | 0 |
| 23.01.2022 15:00 - 16:00 | 0 | 0 | 0 | 0 |
| 23.01.2022 16:00 - 17:00 | 0 | 0 | 0 | 0 |
| 23.01.2022 17:00 - 18:00 | 0 | 0 | 0 | 0 |
| 23.01.2022 18:00 - 19:00 | 0 | 0 | 0 | 0 |
| 23.01.2022 19:00 - 20:00 | 0 | 0 | 0 | 0 |
| 23.01.2022 20:00 - 21:00 | 0 | -50 | 0 | 0 |
| 23.01.2022 21:00 - 22:00 | 0 | -50 | 0 | 0 |
| 23.01.2022 22:00 - 23:00 | 0 | -50 | 0 | 0 |
| 23.01.2022 23:00 - 24:00 | 0 | -50 | 0 | 0 |
| 24.01.2022 00:00 - 01:00 | 0 | -50 | 0 | 0 |
| 24.01.2022 01:00 - 02:00 | 0 | -110 | 0 | 0 |
| 24.01.2022 02:00 - 03:00 | 0 | -110 | 0 | 0 |
| 24.01.2022 03:00 - 04:00 | 0 | -110 | 0 | 0 |
| 24.01.2022 04:00 - 05:00 | 0 | -110 | 0 | 0 |
| 24.01.2022 05:00 - 06:00 | 0 | -110 | 0 | 0 |
| 24.01.2022 06:00 - 07:00 | 0 | 0 | 0 | 0 |
| 24.01.2022 07:00 - 08:00 | 0 | 0 | 0 | 0 |
| 24.01.2022 08:00 - 09:00 | 0 | 0 | 0 | 0 |
| 24.01.2022 09:00 - 10:00 | 0 | 0 | 0 | 0 |
| 24.01.2022 10:00 - 11:00 | 0 | 0 | 0 | 0 |
| 24.01.2022 11:00 - 12:00 | 0 | 0 | 0 | 0 |
| 24.01.2022 12:00 - 13:00 | 0 | 0 | 0 | 0 |
| 24.01.2022 13:00 - 14:00 | 0 | 0 | 0 | 0 |
| 24.01.2022 14:00 - 15:00 | 0 | 0 | 0 | 0 |
| 24.01.2022 15:00 - 16:00 | 0 | 0 | 0 | 0 |
| 24.01.2022 16:00 - 17:00 | 0 | 0 | 0 | 0 |
| 24.01.2022 17:00 - 18:00 | 0 | 0 | 0 | 0 |
| 24.01.2022 18:00 - 19:00 | 0 | 0 | 0 | 0 |
| 24.01.2022 19:00 - 20:00 | 0 | 0 | 0 | 0 |
| 24.01.2022 20:00 - 21:00 | 0 | 0 | 0 | 0 |
| 24.01.2022 21:00 - 22:00 | 0 | -60 | 0 | 0 |
| 24.01.2022 22:00 - 23:00 | 0 | -120 | 0 | 0 |
| 24.01.2022 23:00 - 24:00 | 0 | -120 | 0 | 0 |
| 25.01.2022 00:00 - 01:00 | 0 | -220 | 0 | 0 |
| 25.01.2022 01:00 - 02:00 | 0 | -220 | 0 | 0 |
| 25.01.2022 02:00 - 03:00 | 0 | -220 | 0 | 0 |
| 25.01.2022 03:00 - 04:00 | 0 | -220 | 0 | 0 |
| 25.01.2022 04:00 - 05:00 | 0 | -220 | 0 | 0 |
| 25.01.2022 05:00 - 06:00 | 0 | -220 | 0 | 0 |
| 25.01.2022 06:00 - 07:00 | 0 | 0 | 0 | 0 |
| 25.01.2022 07:00 - 08:00 | 0 | 0 | 0 | 0 |
| 25.01.2022 08:00 - 09:00 | 0 | 0 | 0 | 0 |
| 25.01.2022 09:00 - 10:00 | 0 | 0 | 0 | 0 |
| 25.01.2022 10:00 - 11:00 | 0 | 0 | 0 | 0 |
| 25.01.2022 11:00 - 12:00 | 0 | 0 | 0 | 0 |
| 25.01.2022 12:00 - 13:00 | 0 | 0 | 0 | 0 |
| 25.01.2022 13:00 - 14:00 | 0 | 0 | 0 | 0 |
| 25.01.2022 14:00 - 15:00 | 0 | 0 | 0 | 0 |
| 25.01.2022 15:00 - 16:00 | 0 | 0 | 0 | 0 |
| 25.01.2022 16:00 - 17:00 | 0 | 0 | 0 | 0 |
| 25.01.2022 17:00 - 18:00 | 0 | 0 | 0 | 0 |
| 25.01.2022 18:00 - 19:00 | 0 | 0 | 0 | 0 |
| 25.01.2022 19:00 - 20:00 | 0 | 0 | 0 | 0 |
| 25.01.2022 20:00 - 21:00 | 0 | 0 | 0 | 0 |
| 25.01.2022 21:00 - 22:00 | 0 | 0 | 0 | 0 |
| 25.01.2022 22:00 - 23:00 | 0 | 0 | 0 | 0 |
| 25.01.2022 23:00 - 24:00 | 0 | 0 | 0 | 0 |
| 26.01.2022 00:00 - 01:00 | 0 | 0 | 0 | 0 |
| 26.01.2022 01:00 - 02:00 | 0 | 0 | 0 | 0 |
| 26.01.2022 02:00 - 03:00 | 0 | 0 | 0 | 0 |
| 26.01.2022 03:00 - 04:00 | 0 | 0 | 0 | 0 |
| 26.01.2022 04:00 - 05:00 | 0 | 0 | 0 | 0 |
| 26.01.2022 05:00 - 06:00 | 0 | 0 | 0 | 0 |
| 26.01.2022 06:00 - 07:00 | 0 | 0 | 0 | 0 |
| 26.01.2022 07:00 - 08:00 | 0 | 0 | 0 | 0 |
| 26.01.2022 08:00 - 09:00 | 0 | 0 | 0 | 0 |
| 26.01.2022 09:00 - 10:00 | 0 | 0 | 0 | 0 |
| 26.01.2022 10:00 - 11:00 | 0 | 0 | 0 | 0 |
| 26.01.2022 11:00 - 12:00 | 0 | 0 | 0 | 0 |
| 26.01.2022 12:00 - 13:00 | 0 | 0 | 0 | 0 |
| 26.01.2022 13:00 - 14:00 | 0 | 0 | 0 | 0 |
| 26.01.2022 14:00 - 15:00 | 0 | 0 | 0 | 0 |
| 26.01.2022 15:00 - 16:00 | 0 | 0 | 0 | 0 |
| 26.01.2022 16:00 - 17:00 | 30 | 0 | 0 | 0 |
| 26.01.2022 17:00 - 18:00 | 30 | 0 | 0 | 0 |
| 26.01.2022 18:00 - 19:00 | 30 | 0 | 0 | 0 |
| 26.01.2022 19:00 - 20:00 | 30 | 0 | 0 | 0 |
| 26.01.2022 20:00 - 21:00 | 30 | 0 | 0 | 0 |
| 26.01.2022 21:00 - 22:00 | 30 | 0 | 0 | 0 |
| 26.01.2022 22:00 - 23:00 | 30 | 0 | 0 | 0 |
| 26.01.2022 23:00 - 24:00 | 30 | 0 | 0 | 0 |
| 27.01.2022 00:00 - 01:00 | 30 | 0 | 0 | 0 |
| 27.01.2022 01:00 - 02:00 | 30 | 0 | 0 | 0 |
| 27.01.2022 02:00 - 03:00 | 30 | 0 | 0 | 0 |
| 27.01.2022 03:00 - 04:00 | 30 | 0 | 0 | 0 |
| 27.01.2022 04:00 - 05:00 | 30 | 0 | 0 | 0 |
| 27.01.2022 05:00 - 06:00 | 30 | 0 | 0 | 0 |
| 27.01.2022 06:00 - 07:00 | 0 | 0 | 0 | 0 |
| 27.01.2022 07:00 - 08:00 | 0 | 0 | 0 | 0 |
| 27.01.2022 08:00 - 09:00 | 0 | 0 | 0 | 0 |
| 27.01.2022 09:00 - 10:00 | 0 | 0 | 0 | 0 |
| 27.01.2022 10:00 - 11:00 | 0 | 0 | 0 | 0 |
| 27.01.2022 11:00 - 12:00 | 0 | 0 | 0 | 0 |
| 27.01.2022 12:00 - 13:00 | 0 | 0 | 0 | 0 |
| 27.01.2022 13:00 - 14:00 | 0 | 0 | 0 | 0 |
| 27.01.2022 14:00 - 15:00 | 10 | 0 | 0 | 0 |
| 27.01.2022 15:00 - 16:00 | 30 | 0 | 0 | 0 |
| 27.01.2022 16:00 - 17:00 | 30 | 0 | 0 | 0 |
| 27.01.2022 17:00 - 18:00 | 30 | 0 | 0 | 0 |
| 27.01.2022 18:00 - 19:00 | 30 | 0 | 0 | 0 |
| 27.01.2022 19:00 - 20:00 | 30 | 0 | 0 | 0 |
| 27.01.2022 20:00 - 21:00 | 30 | 0 | 0 | 0 |
| 27.01.2022 21:00 - 22:00 | 30 | 0 | 0 | 0 |
| 27.01.2022 22:00 - 23:00 | 30 | 0 | 0 | 0 |
| 27.01.2022 23:00 - 24:00 | 30 | 0 | 0 | 0 |
| 28.01.2022 00:00 - 01:00 | 30 | 0 | 0 | 0 |
| 28.01.2022 01:00 - 02:00 | 30 | 0 | 0 | 0 |
| 28.01.2022 02:00 - 03:00 | 30 | 0 | 0 | 0 |
| 28.01.2022 03:00 - 04:00 | 30 | 0 | 0 | 0 |
| 28.01.2022 04:00 - 05:00 | 30 | 0 | 0 | 0 |
| 28.01.2022 05:00 - 06:00 | 30 | 0 | 0 | 0 |
| 28.01.2022 06:00 - 07:00 | 0 | 0 | 0 | 0 |
| 28.01.2022 07:00 - 08:00 | 0 | 0 | 0 | 0 |
| 28.01.2022 08:00 - 09:00 | 0 | 0 | 0 | 0 |
| 28.01.2022 09:00 - 10:00 | 0 | 0 | 0 | 0 |
| 28.01.2022 10:00 - 11:00 | 0 | 0 | 0 | 0 |
| 28.01.2022 11:00 - 12:00 | 0 | 0 | 0 | 0 |
| 28.01.2022 12:00 - 13:00 | 0 | 0 | 0 | 0 |
| 28.01.2022 13:00 - 14:00 | 0 | 0 | 0 | 0 |
| 28.01.2022 14:00 - 15:00 | 0 | 0 | 0 | 0 |
| 28.01.2022 15:00 - 16:00 | 0 | 0 | 0 | 0 |
| 28.01.2022 16:00 - 17:00 | 0 | 0 | 0 | 0 |
| 28.01.2022 17:00 - 18:00 | 0 | 0 | 0 | 0 |
| 28.01.2022 18:00 - 19:00 | 0 | 0 | 0 | 0 |
| 28.01.2022 19:00 - 20:00 | 0 | 0 | 0 | 0 |
| 28.01.2022 20:00 - 21:00 | 0 | 0 | 0 | 0 |
| 28.01.2022 21:00 - 22:00 | 0 | 0 | 0 | 0 |
| 28.01.2022 22:00 - 23:00 | 0 | 0 | 0 | 0 |
| 28.01.2022 23:00 - 24:00 | 0 | 0 | 0 | 0 |
| 29.01.2022 00:00 - 01:00 | 0 | -30 | 0 | 0 |
| 29.01.2022 01:00 - 02:00 | 0 | -30 | 0 | 0 |
| 29.01.2022 02:00 - 03:00 | 0 | -30 | 0 | 0 |
| 29.01.2022 03:00 - 04:00 | 0 | -30 | 0 | 0 |
| 29.01.2022 04:00 - 05:00 | 0 | -30 | 0 | 0 |
| 29.01.2022 05:00 - 06:00 | 0 | -30 | 0 | 0 |
| 29.01.2022 06:00 - 07:00 | 0 | 0 | 0 | 0 |
| 29.01.2022 07:00 - 08:00 | 0 | 0 | 0 | 0 |
| 29.01.2022 08:00 - 09:00 | 0 | 0 | 0 | 0 |
| 29.01.2022 09:00 - 10:00 | 0 | 0 | 0 | 0 |
| 29.01.2022 10:00 - 11:00 | 0 | 0 | 0 | 0 |
| 29.01.2022 11:00 - 12:00 | 0 | 0 | 0 | 0 |
| 29.01.2022 12:00 - 13:00 | 0 | 0 | 0 | 0 |
| 29.01.2022 13:00 - 14:00 | 0 | 0 | 0 | 0 |
| 29.01.2022 14:00 - 15:00 | 0 | 0 | 0 | 0 |
| 29.01.2022 15:00 - 16:00 | 0 | 0 | 0 | 0 |
| 29.01.2022 16:00 - 17:00 | 0 | 0 | 0 | 0 |
| 29.01.2022 17:00 - 18:00 | 0 | 0 | 0 | 0 |
| 29.01.2022 18:00 - 19:00 | 0 | -30 | 0 | 0 |
| 29.01.2022 19:00 - 20:00 | 0 | -80 | 0 | 0 |
| 29.01.2022 20:00 - 21:00 | 0 | -80 | 0 | 0 |
| 29.01.2022 21:00 - 22:00 | 0 | -160 | 0 | 0 |
| 29.01.2022 22:00 - 23:00 | 0 | -160 | 0 | 0 |
| 29.01.2022 23:00 - 24:00 | 0 | -160 | 0 | 0 |
| 30.01.2022 00:00 - 01:00 | 0 | -160 | 0 | 0 |
| 30.01.2022 01:00 - 02:00 | 0 | -160 | 0 | 0 |
| 30.01.2022 02:00 - 03:00 | 0 | -160 | 0 | 0 |
| 30.01.2022 03:00 - 04:00 | 0 | -160 | 0 | 0 |
| 30.01.2022 04:00 - 05:00 | 0 | -160 | 0 | 0 |
| 30.01.2022 05:00 - 06:00 | 0 | -160 | 0 | 0 |
| 30.01.2022 06:00 - 07:00 | 0 | 0 | 0 | 0 |
| 30.01.2022 07:00 - 08:00 | 0 | 0 | 0 | 0 |
| 30.01.2022 08:00 - 09:00 | 0 | 0 | 0 | 0 |
| 30.01.2022 09:00 - 10:00 | 0 | 0 | 0 | 0 |
| 30.01.2022 10:00 - 11:00 | 0 | 0 | 0 | 0 |
| 30.01.2022 11:00 - 12:00 | 0 | 0 | 0 | 0 |
| 30.01.2022 12:00 - 13:00 | 0 | 0 | 0 | 0 |
| 30.01.2022 13:00 - 14:00 | 0 | 0 | 0 | 0 |
| 30.01.2022 14:00 - 15:00 | 0 | 0 | 0 | 0 |
| 30.01.2022 15:00 - 16:00 | 0 | 0 | 0 | 0 |
| 30.01.2022 16:00 - 17:00 | 0 | 0 | 0 | 0 |
| 30.01.2022 17:00 - 18:00 | 0 | 0 | 0 | 0 |
| 30.01.2022 18:00 - 19:00 | 0 | 0 | 0 | 0 |
| 30.01.2022 19:00 - 20:00 | 0 | 0 | 0 | 0 |
| 30.01.2022 20:00 - 21:00 | 0 | -50 | 0 | 0 |
| 30.01.2022 21:00 - 22:00 | 0 | -100 | 0 | 0 |
| 30.01.2022 22:00 - 23:00 | 0 | -100 | 0 | 0 |
| 30.01.2022 23:00 - 24:00 | 0 | -150 | 0 | 0 |
| 31.01.2022 00:00 - 01:00 | 200 | -150 | 0 | 0 |
| 31.01.2022 01:00 - 02:00 | 200 | -150 | 0 | 0 |
| 31.01.2022 02:00 - 03:00 | 450 | -150 | 0 | 0 |
| 31.01.2022 03:00 - 04:00 | 450 | -150 | 0 | 0 |
| 31.01.2022 04:00 - 05:00 | 450 | -150 | 0 | 0 |
| 31.01.2022 05:00 - 06:00 | 450 | -150 | 0 | 0 |
| 31.01.2022 06:00 - 07:00 | 0 | 0 | 0 | 0 |
| 31.01.2022 07:00 - 08:00 | 0 | 0 | 0 | 0 |
| 31.01.2022 08:00 - 09:00 | 0 | 0 | 0 | 0 |
| 31.01.2022 09:00 - 10:00 | 0 | 0 | 0 | 0 |
| 31.01.2022 10:00 - 11:00 | 0 | 0 | 0 | 0 |
| 31.01.2022 11:00 - 12:00 | 0 | 0 | 0 | 0 |
| 31.01.2022 12:00 - 13:00 | 0 | 0 | 0 | 0 |
| 31.01.2022 13:00 - 14:00 | 0 | 0 | 0 | 0 |
| 31.01.2022 14:00 - 15:00 | 0 | 0 | 0 | 0 |
| 31.01.2022 15:00 - 16:00 | 0 | 0 | 0 | 0 |
| 31.01.2022 16:00 - 17:00 | 0 | 0 | 0 | 0 |
| 31.01.2022 17:00 - 18:00 | 0 | 0 | 0 | 0 |
| 31.01.2022 18:00 - 19:00 | 0 | 0 | 0 | 0 |
| 31.01.2022 19:00 - 20:00 | 0 | 0 | 0 | 0 |
| 31.01.2022 20:00 - 21:00 | 0 | 0 | 0 | 0 |
| 31.01.2022 21:00 - 22:00 | 0 | 0 | 0 | 0 |
| 31.01.2022 22:00 - 23:00 | 0 | 0 | 0 | 0 |
| 31.01.2022 23:00 - 24:00 | 0 | 0 | 0 | 0 |
| 01.02.2022 00:00 - 01:00 | 0 | 0 | 0 | 0 |
| 01.02.2022 01:00 - 02:00 | 0 | 0 | 0 | 0 |
| 01.02.2022 02:00 - 03:00 | 0 | 0 | 0 | 0 |
| 01.02.2022 03:00 - 04:00 | 100 | 0 | 0 | 0 |
| 01.02.2022 04:00 - 05:00 | 100 | 0 | 0 | 0 |
| 01.02.2022 05:00 - 06:00 | 100 | 0 | 0 | 0 |